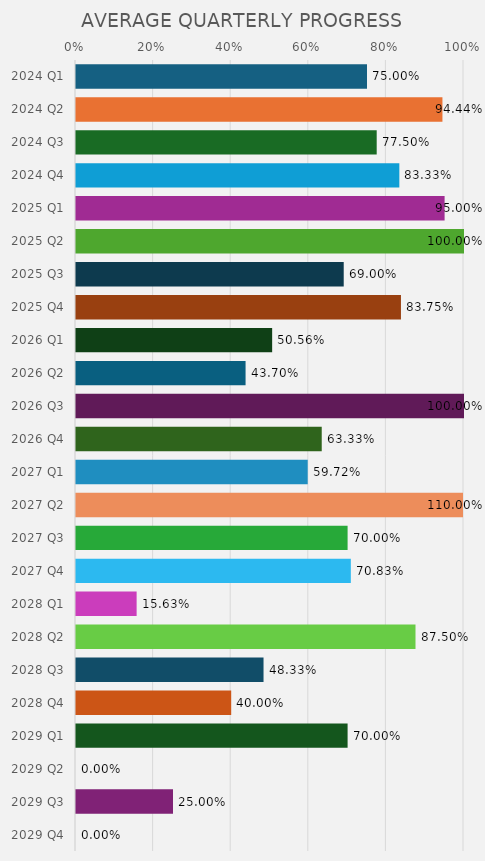
| Category | Series 0 |
|---|---|
| 2024 Q1 | 0.75 |
| 2024 Q2 | 0.944 |
| 2024 Q3 | 0.775 |
| 2024 Q4 | 0.833 |
| 2025 Q1 | 0.95 |
| 2025 Q2 | 1 |
| 2025 Q3 | 0.69 |
| 2025 Q4 | 0.838 |
| 2026 Q1 | 0.506 |
| 2026 Q2 | 0.437 |
| 2026 Q3 | 1 |
| 2026 Q4 | 0.633 |
| 2027 Q1 | 0.597 |
| 2027 Q2 | 1.1 |
| 2027 Q3 | 0.7 |
| 2027 Q4 | 0.708 |
| 2028 Q1 | 0.156 |
| 2028 Q2 | 0.875 |
| 2028 Q3 | 0.483 |
| 2028 Q4 | 0.4 |
| 2029 Q1 | 0.7 |
| 2029 Q2 | 0 |
| 2029 Q3 | 0.25 |
| 2029 Q4 | 0 |